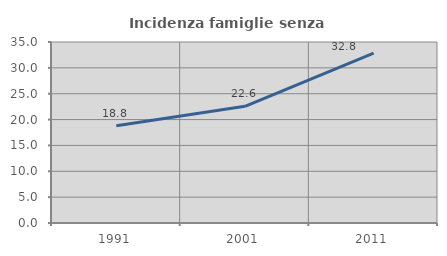
| Category | Incidenza famiglie senza nuclei |
|---|---|
| 1991.0 | 18.822 |
| 2001.0 | 22.566 |
| 2011.0 | 32.84 |